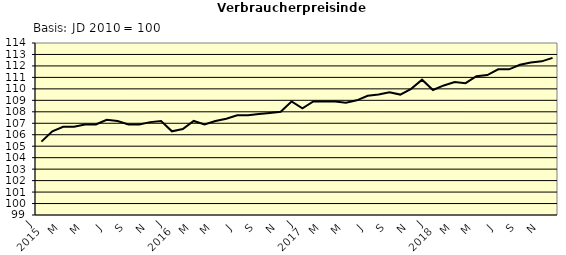
| Category | Series 0 |
|---|---|
| 0 | 105.4 |
| 1 | 106.3 |
| 2 | 106.7 |
| 3 | 106.7 |
| 4 | 106.9 |
| 5 | 106.9 |
| 6 | 107.3 |
| 7 | 107.2 |
| 8 | 106.9 |
| 9 | 106.9 |
| 10 | 107.1 |
| 11 | 107.2 |
| 12 | 106.3 |
| 13 | 106.5 |
| 14 | 107.2 |
| 15 | 106.9 |
| 16 | 107.2 |
| 17 | 107.4 |
| 18 | 107.7 |
| 19 | 107.7 |
| 20 | 107.8 |
| 21 | 107.9 |
| 22 | 108 |
| 23 | 108.9 |
| 24 | 108.3 |
| 25 | 108.9 |
| 26 | 108.9 |
| 27 | 108.9 |
| 28 | 108.8 |
| 29 | 109 |
| 30 | 109.4 |
| 31 | 109.5 |
| 32 | 109.7 |
| 33 | 109.5 |
| 34 | 110 |
| 35 | 110.8 |
| 36 | 109.9 |
| 37 | 110.3 |
| 38 | 110.6 |
| 39 | 110.5 |
| 40 | 111.1 |
| 41 | 111.2 |
| 42 | 111.7 |
| 43 | 111.7 |
| 44 | 112.1 |
| 45 | 112.3 |
| 46 | 112.4 |
| 47 | 112.7 |